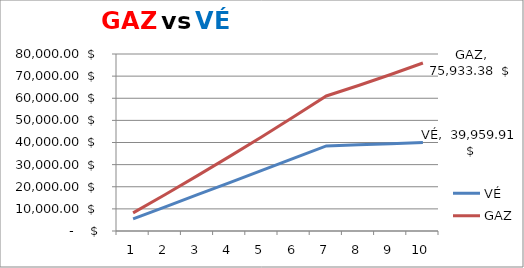
| Category | VÉ | GAZ |
|---|---|---|
| 0 | 5459.6 | 8169.44 |
| 1 | 10930.2 | 16506.93 |
| 2 | 16412.17 | 25020.872 |
| 3 | 21905.895 | 33720.09 |
| 4 | 27411.775 | 42613.847 |
| 5 | 32930.228 | 51711.869 |
| 6 | 38461.686 | 61024.37 |
| 7 | 38947.002 | 65753.635 |
| 8 | 39446.245 | 70719.363 |
| 9 | 39959.906 | 75933.377 |